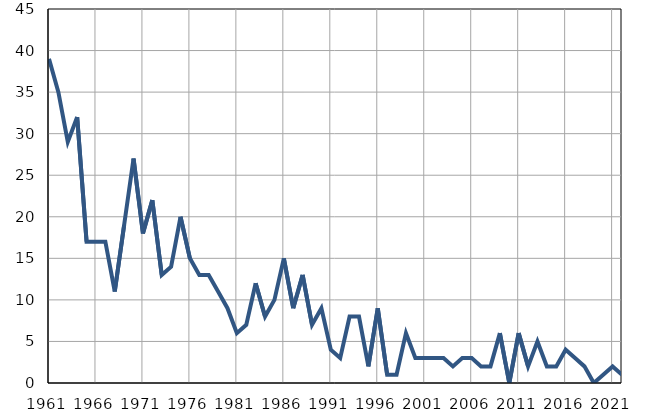
| Category | Умрла 
одојчад |
|---|---|
| 1961.0 | 39 |
| 1962.0 | 35 |
| 1963.0 | 29 |
| 1964.0 | 32 |
| 1965.0 | 17 |
| 1966.0 | 17 |
| 1967.0 | 17 |
| 1968.0 | 11 |
| 1969.0 | 19 |
| 1970.0 | 27 |
| 1971.0 | 18 |
| 1972.0 | 22 |
| 1973.0 | 13 |
| 1974.0 | 14 |
| 1975.0 | 20 |
| 1976.0 | 15 |
| 1977.0 | 13 |
| 1978.0 | 13 |
| 1979.0 | 11 |
| 1980.0 | 9 |
| 1981.0 | 6 |
| 1982.0 | 7 |
| 1983.0 | 12 |
| 1984.0 | 8 |
| 1985.0 | 10 |
| 1986.0 | 15 |
| 1987.0 | 9 |
| 1988.0 | 13 |
| 1989.0 | 7 |
| 1990.0 | 9 |
| 1991.0 | 4 |
| 1992.0 | 3 |
| 1993.0 | 8 |
| 1994.0 | 8 |
| 1995.0 | 2 |
| 1996.0 | 9 |
| 1997.0 | 1 |
| 1998.0 | 1 |
| 1999.0 | 6 |
| 2000.0 | 3 |
| 2001.0 | 3 |
| 2002.0 | 3 |
| 2003.0 | 3 |
| 2004.0 | 2 |
| 2005.0 | 3 |
| 2006.0 | 3 |
| 2007.0 | 2 |
| 2008.0 | 2 |
| 2009.0 | 6 |
| 2010.0 | 0 |
| 2011.0 | 6 |
| 2012.0 | 2 |
| 2013.0 | 5 |
| 2014.0 | 2 |
| 2015.0 | 2 |
| 2016.0 | 4 |
| 2017.0 | 3 |
| 2018.0 | 2 |
| 2019.0 | 0 |
| 2020.0 | 1 |
| 2021.0 | 2 |
| 2022.0 | 1 |